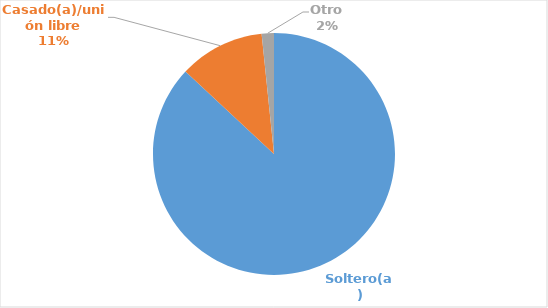
| Category | Series 0 |
|---|---|
| Soltero(a) | 0.869 |
| Casado(a)/unión libre | 0.114 |
| Otro | 0.016 |